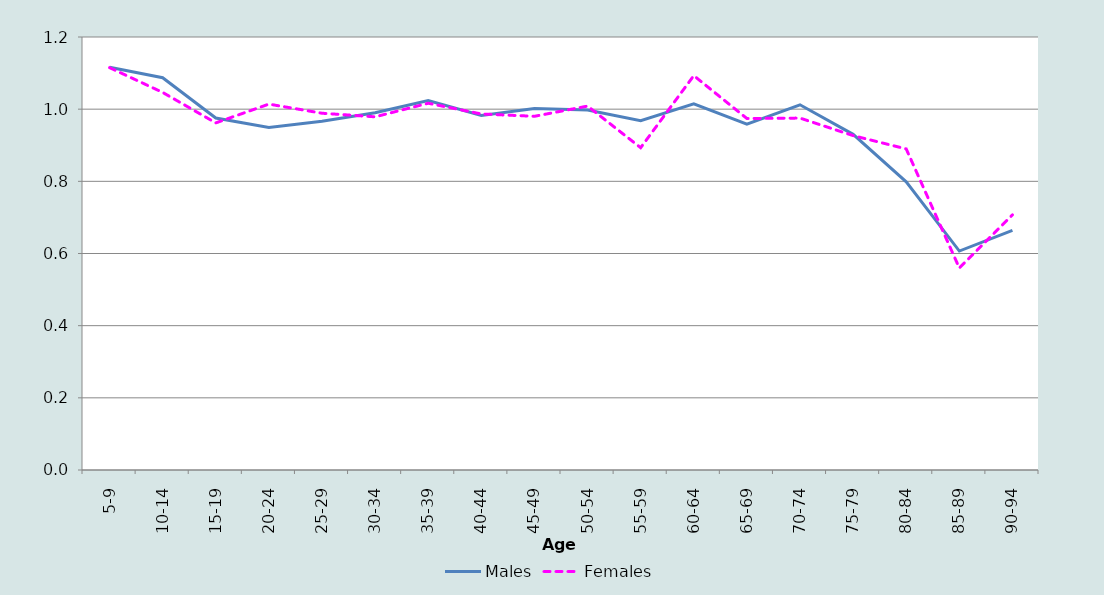
| Category | Males | Females |
|---|---|---|
| 5-9 | 1.116 | 1.115 |
| 10-14 | 1.087 | 1.046 |
| 15-19 | 0.975 | 0.962 |
| 20-24 | 0.949 | 1.014 |
| 25-29 | 0.966 | 0.989 |
| 30-34 | 0.99 | 0.979 |
| 35-39 | 1.024 | 1.016 |
| 40-44 | 0.983 | 0.987 |
| 45-49 | 1.002 | 0.98 |
| 50-54 | 0.997 | 1.009 |
| 55-59 | 0.968 | 0.893 |
| 60-64 | 1.015 | 1.093 |
| 65-69 | 0.958 | 0.974 |
| 70-74 | 1.012 | 0.975 |
| 75-79 | 0.93 | 0.927 |
| 80-84 | 0.799 | 0.89 |
| 85-89 | 0.607 | 0.56 |
| 90-94 | 0.664 | 0.707 |